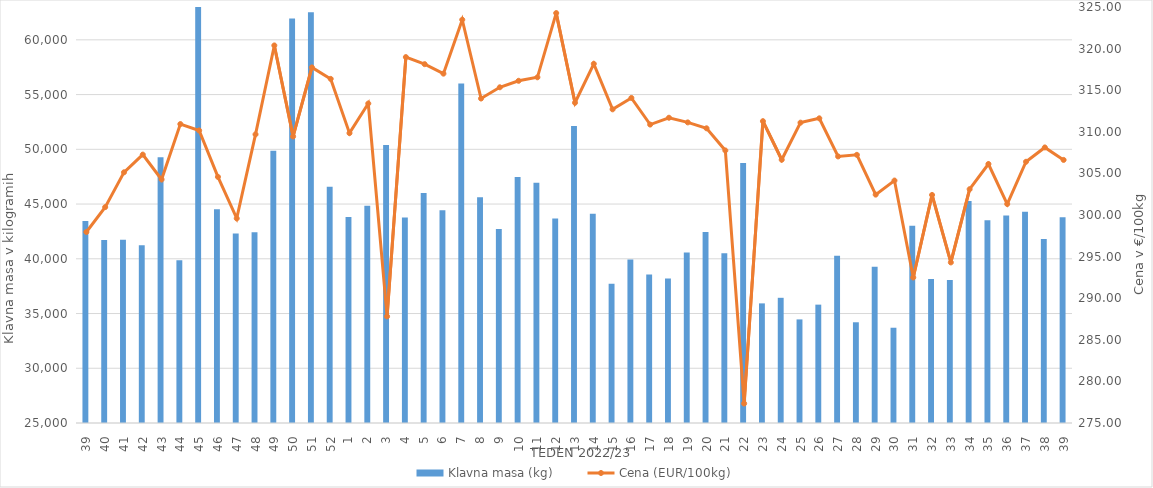
| Category | Klavna masa (kg) |
|---|---|
| 39.0 | 43447 |
| 40.0 | 41711 |
| 41.0 | 41736 |
| 42.0 | 41239 |
| 43.0 | 49284 |
| 44.0 | 39877 |
| 45.0 | 63668 |
| 46.0 | 44528 |
| 47.0 | 42319 |
| 48.0 | 42416 |
| 49.0 | 49873 |
| 50.0 | 61942 |
| 51.0 | 62514 |
| 52.0 | 46589 |
| 1.0 | 43807 |
| 2.0 | 44834 |
| 3.0 | 50386 |
| 4.0 | 43773 |
| 5.0 | 46011 |
| 6.0 | 44439 |
| 7.0 | 56001 |
| 8.0 | 45613 |
| 9.0 | 42730 |
| 10.0 | 47471 |
| 11.0 | 46952 |
| 12.0 | 43683 |
| 13.0 | 52135 |
| 14.0 | 44103 |
| 15.0 | 37719 |
| 16.0 | 39943 |
| 17.0 | 38574 |
| 18.0 | 38200 |
| 19.0 | 40581 |
| 20.0 | 42443 |
| 21.0 | 40517 |
| 22.0 | 48742 |
| 23.0 | 35927 |
| 24.0 | 36436 |
| 25.0 | 34463 |
| 26.0 | 35812 |
| 27.0 | 40280 |
| 28.0 | 34201 |
| 29.0 | 39279 |
| 30.0 | 33702 |
| 31.0 | 43020 |
| 32.0 | 38146 |
| 33.0 | 38070 |
| 34.0 | 45290 |
| 35.0 | 43513 |
| 36.0 | 43945 |
| 37.0 | 44302 |
| 38.0 | 41798 |
| 39.0 | 43790 |